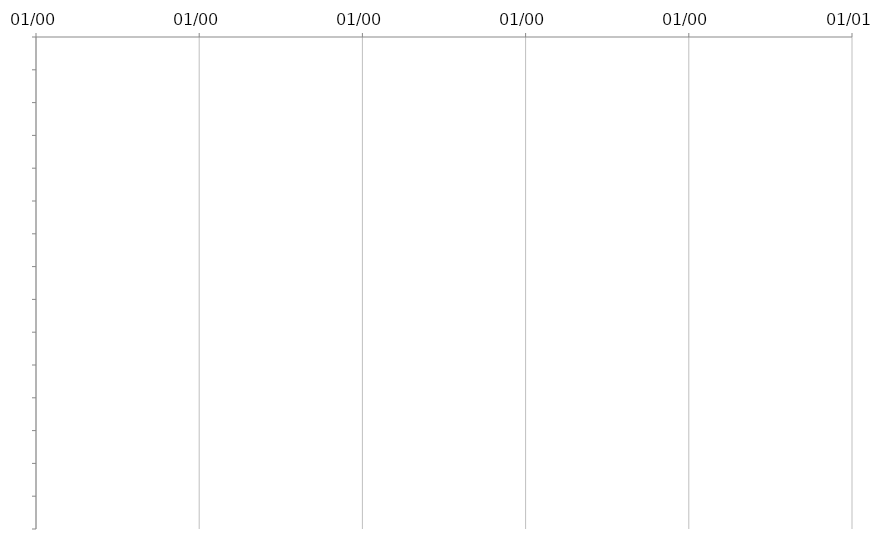
| Category | START | DAYS |
|---|---|---|
|  |  | 0 |
|  |  | 0 |
|  |  | 0 |
|  |  | 0 |
|  |  | 0 |
|  |  | 0 |
|  |  | 0 |
|  |  | 0 |
|  |  | 0 |
|  |  | 0 |
|  |  | 0 |
|  |  | 0 |
|  |  | 0 |
|  |  | 0 |
|  |  | 0 |